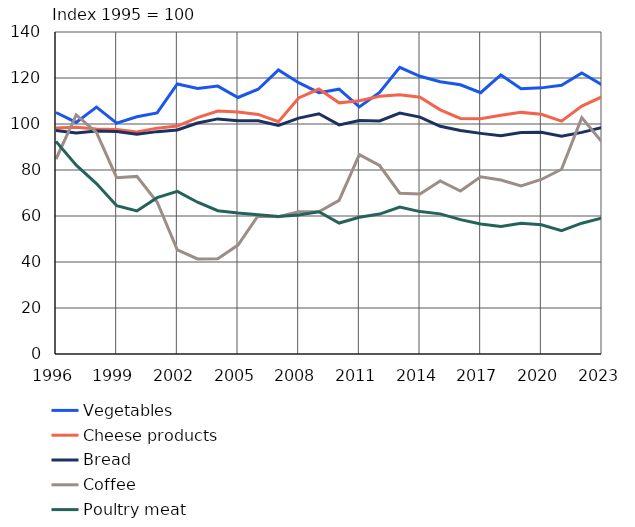
| Category | Vegetables | Cheese products | Bread | Coffee | Poultry meat |
|---|---|---|---|---|---|
| 1996.0 | 105 | 98.23 | 97.14 | 84.77 | 92.45 |
| 1997.0 | 100.7 | 98.57 | 96.1 | 103.93 | 82.08 |
| 1998.0 | 107.32 | 97.83 | 96.92 | 96.38 | 74.09 |
| 1999.0 | 100.41 | 97.58 | 96.77 | 76.64 | 64.49 |
| 2000.0 | 103.16 | 96.51 | 95.59 | 77.22 | 62.22 |
| 2001.0 | 104.84 | 98.2 | 96.68 | 66.07 | 67.99 |
| 2002.0 | 117.43 | 99.08 | 97.42 | 45.29 | 70.68 |
| 2003.0 | 115.48 | 102.81 | 100.41 | 41.33 | 66 |
| 2004.0 | 116.48 | 105.64 | 102.22 | 41.38 | 62.29 |
| 2005.0 | 111.53 | 105.24 | 101.45 | 47.35 | 61.3 |
| 2006.0 | 115.11 | 104.16 | 101.36 | 60.22 | 60.53 |
| 2007.0 | 123.48 | 100.99 | 99.35 | 59.72 | 59.79 |
| 2008.0 | 117.95 | 111.32 | 102.55 | 61.85 | 60.48 |
| 2009.0 | 113.65 | 115.2 | 104.46 | 61.81 | 61.86 |
| 2010.0 | 115.15 | 109.19 | 99.62 | 66.78 | 56.93 |
| 2011.0 | 107.41 | 110.09 | 101.5 | 86.71 | 59.46 |
| 2012.0 | 113.75 | 112.03 | 101.33 | 81.95 | 60.85 |
| 2013.0 | 124.62 | 112.73 | 104.76 | 69.91 | 63.92 |
| 2014.0 | 120.73 | 111.6 | 103 | 69.56 | 61.91 |
| 2015.0 | 118.4 | 106.15 | 98.99 | 75.24 | 60.92 |
| 2016.0 | 117.06 | 102.43 | 97.14 | 70.88 | 58.43 |
| 2017.0 | 113.59 | 102.32 | 95.93 | 77.03 | 56.54 |
| 2018.0 | 121.34 | 103.79 | 94.89 | 75.66 | 55.4 |
| 2019.0 | 115.32 | 105.05 | 96.29 | 73.08 | 56.83 |
| 2020.0 | 115.71 | 104.21 | 96.44 | 75.88 | 56.16 |
| 2021.0 | 116.8 | 101.22 | 94.71 | 80.32 | 53.63 |
| 2022.0 | 122.19 | 107.76 | 96.36 | 102.76 | 56.88 |
| 2023.0 | 117 | 111.82 | 98.44 | 92.16 | 59.14 |